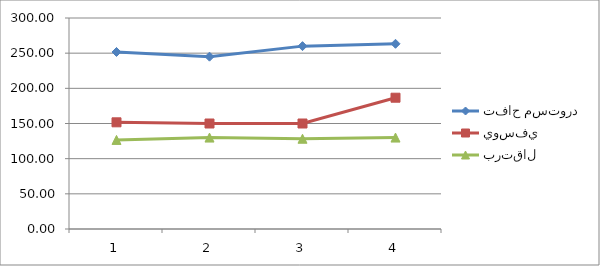
| Category | تفاح مستورد | يوسفي | برتقال |
|---|---|---|---|
| 0 | 251.67 | 151.67 | 126.67 |
| 1 | 245 | 150 | 130 |
| 2 | 260 | 150 | 128.33 |
| 3 | 263.33 | 186.67 | 130 |